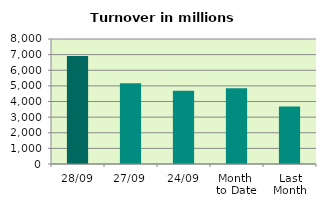
| Category | Series 0 |
|---|---|
| 28/09 | 6912.458 |
| 27/09 | 5170.209 |
| 24/09 | 4690.749 |
| Month 
to Date | 4845.593 |
| Last
Month | 3679.291 |